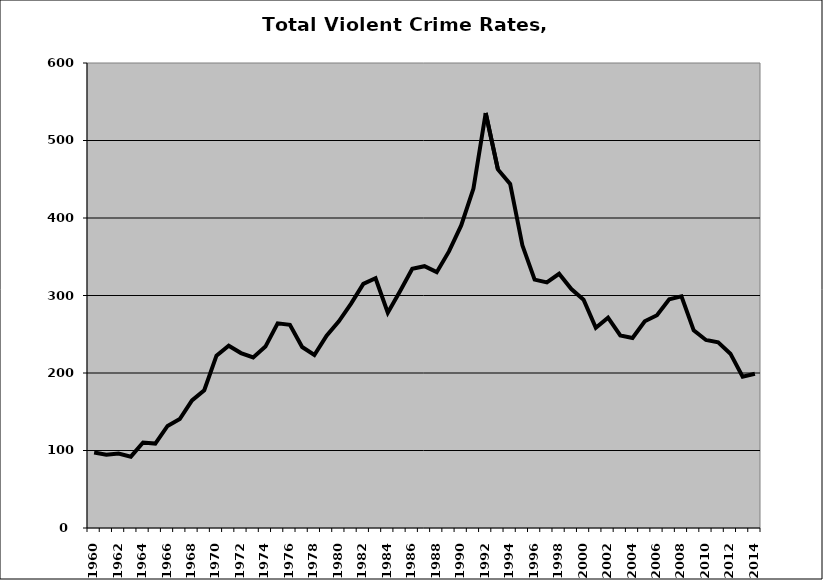
| Category | VCR |
|---|---|
| 1960.0 | 97.329 |
| 1961.0 | 94.506 |
| 1962.0 | 96.139 |
| 1963.0 | 92.052 |
| 1964.0 | 110.351 |
| 1965.0 | 108.934 |
| 1966.0 | 131.668 |
| 1967.0 | 140.608 |
| 1968.0 | 164.664 |
| 1969.0 | 177.754 |
| 1970.0 | 222.315 |
| 1971.0 | 235.131 |
| 1972.0 | 225.705 |
| 1973.0 | 220.108 |
| 1974.0 | 234.048 |
| 1975.0 | 264.046 |
| 1976.0 | 262.165 |
| 1977.0 | 233.574 |
| 1978.0 | 223.185 |
| 1979.0 | 248.029 |
| 1980.0 | 266.677 |
| 1981.0 | 289.511 |
| 1982.0 | 314.971 |
| 1983.0 | 322.213 |
| 1984.0 | 277.787 |
| 1985.0 | 305.529 |
| 1986.0 | 334.415 |
| 1987.0 | 337.778 |
| 1988.0 | 330.126 |
| 1989.0 | 356.909 |
| 1990.0 | 390.362 |
| 1991.0 | 437.975 |
| 1992.0 | 535.473 |
| 1993.0 | 462.655 |
| 1994.0 | 443.977 |
| 1995.0 | 364.741 |
| 1996.0 | 320.494 |
| 1997.0 | 316.94 |
| 1998.0 | 327.973 |
| 1999.0 | 308.32 |
| 2000.0 | 294.5 |
| 2001.0 | 258.306 |
| 2002.0 | 271.43 |
| 2003.0 | 248.459 |
| 2004.0 | 245.109 |
| 2005.0 | 266.836 |
| 2006.0 | 274.603 |
| 2007.0 | 295.204 |
| 2008.0 | 298.862 |
| 2009.0 | 254.977 |
| 2010.0 | 242.616 |
| 2011.0 | 239.648 |
| 2012.0 | 224.945 |
| 2013.0 | 195.132 |
| 2014.0 | 199.005 |